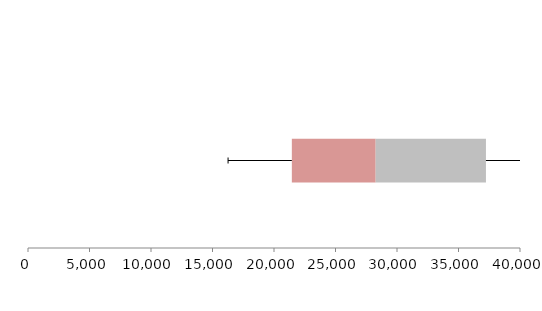
| Category | Series 1 | Series 2 | Series 3 |
|---|---|---|---|
| 0 | 21450.718 | 6815.621 | 8965.577 |